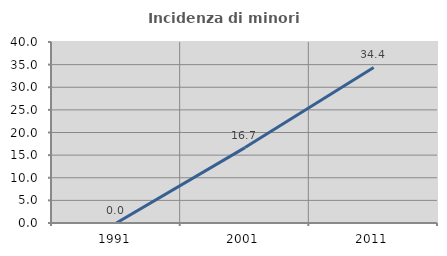
| Category | Incidenza di minori stranieri |
|---|---|
| 1991.0 | 0 |
| 2001.0 | 16.667 |
| 2011.0 | 34.375 |